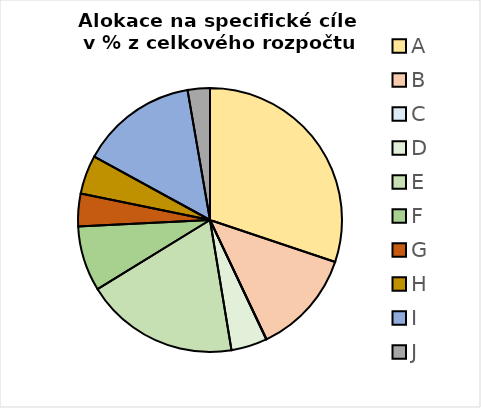
| Category | Series 0 |
|---|---|
| A | 0.301 |
| B | 0.128 |
| C | 0 |
| D | 0.044 |
| E | 0.188 |
| F | 0.08 |
| G | 0.04 |
| H | 0.048 |
| I | 0.143 |
| J | 0.027 |